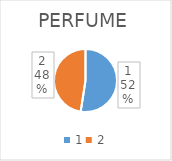
| Category | PERFUME |
|---|---|
| 0 | 30458 |
| 1 | 27620 |